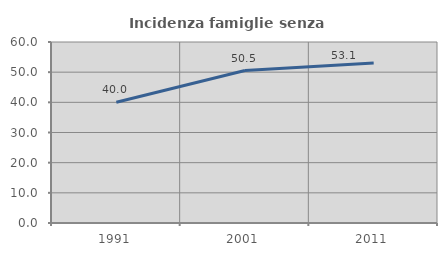
| Category | Incidenza famiglie senza nuclei |
|---|---|
| 1991.0 | 40.035 |
| 2001.0 | 50.545 |
| 2011.0 | 53.078 |